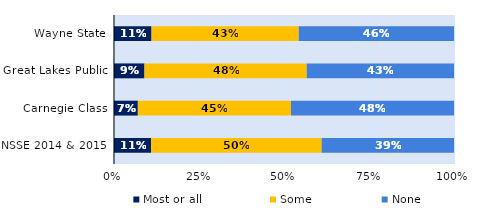
| Category | Most or all | Some | None |
|---|---|---|---|
| Wayne State | 0.11 | 0.433 | 0.457 |
| Great Lakes Public | 0.09 | 0.477 | 0.433 |
| Carnegie Class | 0.07 | 0.45 | 0.48 |
| NSSE 2014 & 2015 | 0.109 | 0.502 | 0.389 |